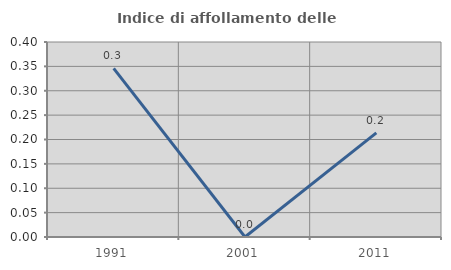
| Category | Indice di affollamento delle abitazioni  |
|---|---|
| 1991.0 | 0.346 |
| 2001.0 | 0 |
| 2011.0 | 0.214 |